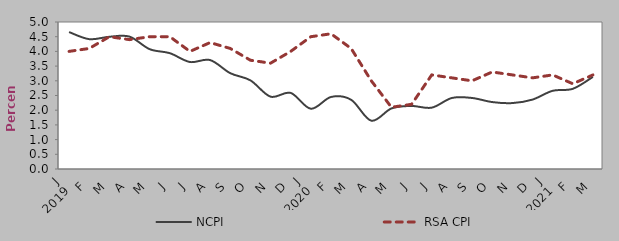
| Category | NCPI | RSA CPI |
|---|---|---|
| 0 | 4.658 | 4 |
| 1900-01-01 | 4.416 | 4.1 |
| 1900-01-02 | 4.498 | 4.5 |
| 1900-01-03 | 4.503 | 4.4 |
| 1900-01-04 | 4.076 | 4.5 |
| 1900-01-05 | 3.939 | 4.5 |
| 1900-01-06 | 3.639 | 4 |
| 1900-01-07 | 3.705 | 4.3 |
| 1900-01-08 | 3.259 | 4.1 |
| 1900-01-09 | 3.015 | 3.7 |
| 1900-01-10 | 2.461 | 3.6 |
| 1900-01-11 | 2.588 | 4 |
| 1900-01-12 | 2.05 | 4.5 |
| 1900-01-13 | 2.45 | 4.6 |
| 1900-01-14 | 2.354 | 4.1 |
| 1900-01-15 | 1.643 | 3 |
| 1900-01-16 | 2.06 | 2.1 |
| 1900-01-17 | 2.145 | 2.2 |
| 1900-01-18 | 2.087 | 3.2 |
| 1900-01-19 | 2.416 | 3.1 |
| 1900-01-20 | 2.416 | 3 |
| 1900-01-21 | 2.277 | 3.3 |
| 1900-01-22 | 2.242 | 3.2 |
| 1900-01-23 | 2.361 | 3.1 |
| 1900-01-24 | 2.66 | 3.2 |
| 1900-01-25 | 2.728 | 2.9 |
| 1900-01-26 | 3.133 | 3.2 |